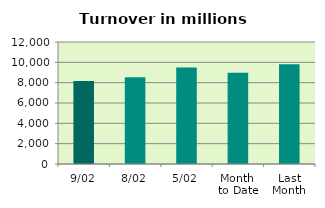
| Category | Series 0 |
|---|---|
| 9/02 | 8173.6 |
| 8/02 | 8542.982 |
| 5/02 | 9490.804 |
| Month 
to Date | 8974.277 |
| Last
Month | 9809.456 |